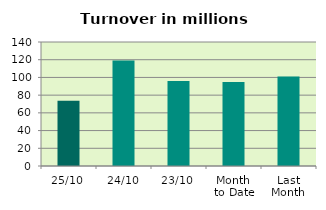
| Category | Series 0 |
|---|---|
| 25/10 | 73.795 |
| 24/10 | 119.093 |
| 23/10 | 95.96 |
| Month 
to Date | 94.749 |
| Last
Month | 100.935 |